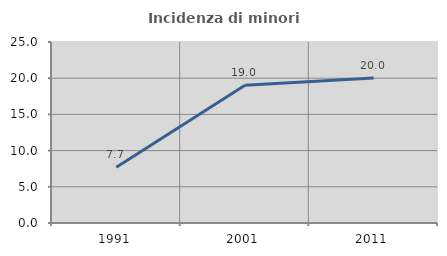
| Category | Incidenza di minori stranieri |
|---|---|
| 1991.0 | 7.692 |
| 2001.0 | 19.031 |
| 2011.0 | 20.036 |